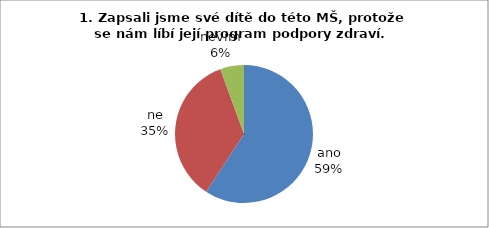
| Category | 1. |
|---|---|
| ano | 32 |
| ne | 19 |
| nevím | 3 |